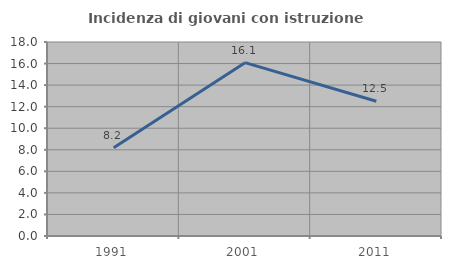
| Category | Incidenza di giovani con istruzione universitaria |
|---|---|
| 1991.0 | 8.187 |
| 2001.0 | 16.084 |
| 2011.0 | 12.5 |